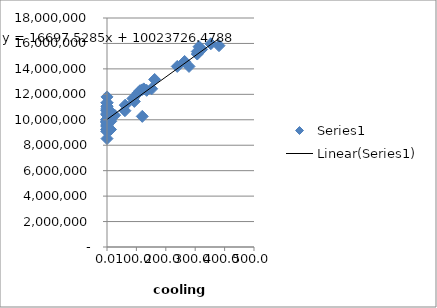
| Category | Series 0 |
|---|---|
| 0.0 | 11017000 |
| 0.0 | 10029000 |
| 0.0 | 9650000 |
| 0.0 | 9193800 |
| 17.0 | 10424000 |
| 135.0 | 12314600 |
| 322.0 | 15531600 |
| 313.0 | 15744800 |
| 112.0 | 12279100 |
| 0.0 | 9787769 |
| 0.0 | 9463374 |
| 0.0 | 10727018 |
| 0.0 | 10388282 |
| 0.0 | 9088503 |
| 0.0 | 10038019 |
| 0.0 | 9075069 |
| 13.0 | 9883158 |
| 125.0 | 12428294 |
| 264.0 | 14584189 |
| 162.0 | 13168342 |
| 93.0 | 11443090 |
| 19.0 | 10471826 |
| 0.0 | 9975396 |
| 0.0 | 11334216 |
| 0.0 | 11797984 |
| 0.0 | 9781796 |
| 0.0 | 10507661 |
| 0.0 | 9557867 |
| 62.0 | 11150779 |
| 118.0 | 12345214 |
| 307.0 | 15167438 |
| 307.0 | 15365737.99 |
| 106.0 | 12120696.77 |
| 0.0 | 10403342.15 |
| 0.0 | 10026685.54 |
| 0.0 | 10781685.4 |
| 0.0 | 11345449.05 |
| 0.0 | 9868247.95 |
| 0.0 | 9967546.01 |
| 0.0 | 9247748.5 |
| 26.0 | 10358833.58 |
| 120.0 | 10266670.8 |
| 353.0 | 15974206.44 |
| 239.0 | 14193769.75 |
| 88.0 | 11671171.73 |
| 7.0 | 10185941.01 |
| 0.0 | 9875322.72 |
| 0.0 | 11072170.31 |
| 0.0 | 10867937.611 |
| 0.0 | 9858069.738 |
| 0.0 | 9510643.758 |
| 0.0 | 8521450.531 |
| 12.0 | 9235603.731 |
| 152.0 | 12435200.266 |
| 381.0 | 15823760.2 |
| 279.0 | 14192040 |
| 61.0 | 10712390 |
| 0.0 | 9256725 |
| 0.0 | 9232897 |
| 0.0 | 10715198 |